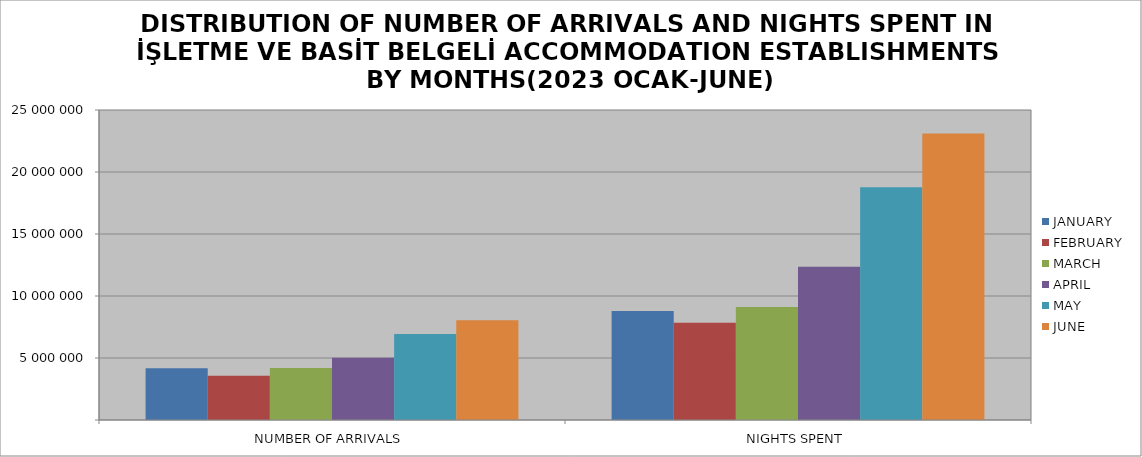
| Category | JANUARY | FEBRUARY | MARCH | APRIL | MAY | JUNE |
|---|---|---|---|---|---|---|
| NUMBER OF ARRIVALS | 4176369 | 3577989 | 4200030 | 5022587 | 6927000 | 8050681 |
| NIGHTS SPENT | 8783046 | 7837722 | 9122802 | 12360237 | 18778808 | 23106038 |